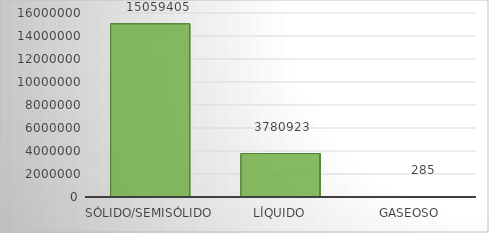
| Category | Series 0 |
|---|---|
| Sólido/Semisólido | 15059405.47 |
| Líquido | 3780922.93 |
| Gaseoso | 284.5 |